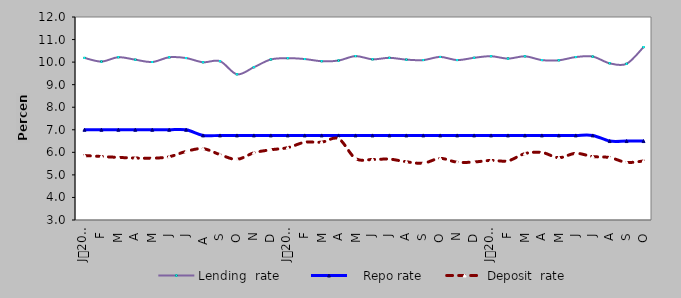
| Category | Lending  rate |    Repo rate | Deposit  rate |
|---|---|---|---|
| 0 | 10.187 | 7 | 5.858 |
| 1900-01-01 | 10.024 | 7 | 5.815 |
| 1900-01-02 | 10.218 | 7 | 5.776 |
| 1900-01-03 | 10.107 | 7 | 5.746 |
| 1900-01-04 | 10.004 | 7 | 5.74 |
| 1900-01-05 | 10.214 | 7 | 5.804 |
| 1900-01-06 | 10.18 | 7 | 6.04 |
| 1900-01-07 | 9.994 | 6.75 | 6.162 |
| 1900-01-08 | 10.042 | 6.75 | 5.898 |
| 1900-01-09 | 9.46 | 6.75 | 5.69 |
| 1900-01-10 | 9.774 | 6.75 | 5.98 |
| 1900-01-11 | 10.117 | 6.75 | 6.113 |
| 1900-01-12 | 10.174 | 6.75 | 6.207 |
| 1900-01-13 | 10.136 | 6.75 | 6.446 |
| 1900-01-14 | 10.04 | 6.75 | 6.45 |
| 1900-01-15 | 10.07 | 6.75 | 6.6 |
| 1900-01-16 | 10.265 | 6.75 | 5.728 |
| 1900-01-17 | 10.125 | 6.75 | 5.682 |
| 1900-01-18 | 10.19 | 6.75 | 5.7 |
| 1900-01-19 | 10.11 | 6.75 | 5.58 |
| 1900-01-20 | 10.09 | 6.75 | 5.52 |
| 1900-01-21 | 10.23 | 6.75 | 5.73 |
| 1900-01-22 | 10.09 | 6.75 | 5.56 |
| 1900-01-23 | 10.192 | 6.75 | 5.572 |
| 1900-01-24 | 10.261 | 6.75 | 5.643 |
| 1900-01-25 | 10.155 | 6.75 | 5.624 |
| 1900-01-26 | 10.257 | 6.75 | 5.943 |
| 1900-01-27 | 10.09 | 6.75 | 5.994 |
| 1900-01-28 | 10.081 | 6.75 | 5.764 |
| 1900-01-29 | 10.224 | 6.75 | 5.956 |
| 1900-01-30 | 10.245 | 6.75 | 5.813 |
| 1900-01-31 | 9.948 | 6.5 | 5.769 |
| 1900-02-01 | 9.925 | 6.5 | 5.555 |
| 1900-02-02 | 10.666 | 6.5 | 5.616 |